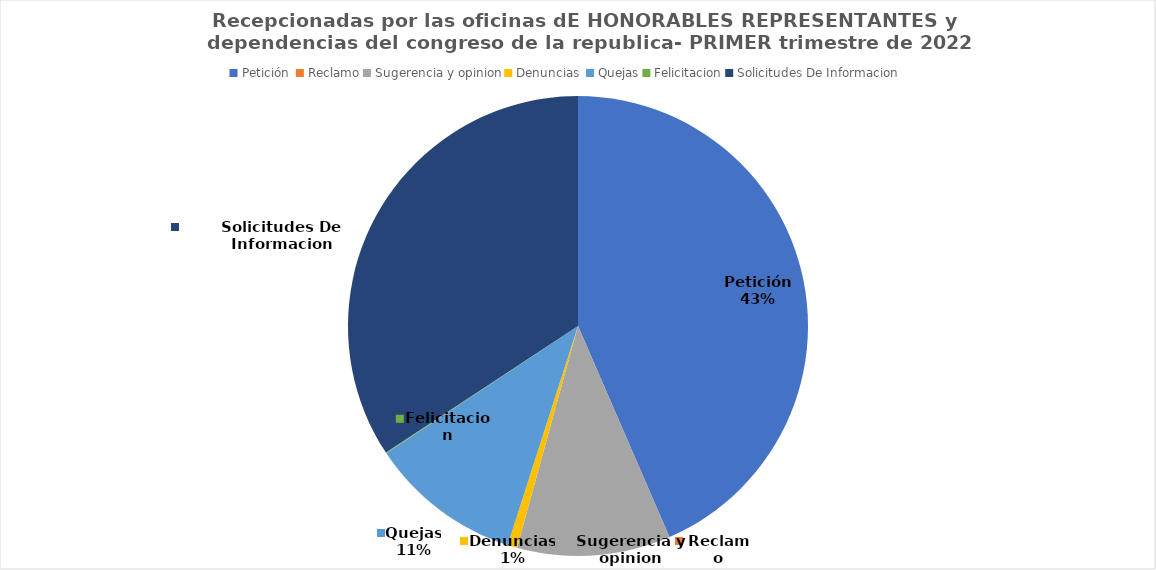
| Category | Series 0 |
|---|---|
| Petición  | 835 |
| Reclamo | 0 |
| Sugerencia y opinion | 207 |
| Denuncias  | 13 |
| Quejas | 206 |
| Felicitacion | 1 |
| Solicitudes De Informacion | 658 |